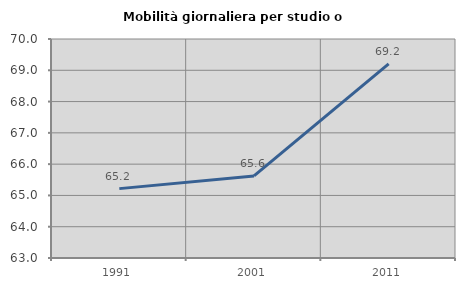
| Category | Mobilità giornaliera per studio o lavoro |
|---|---|
| 1991.0 | 65.217 |
| 2001.0 | 65.622 |
| 2011.0 | 69.206 |